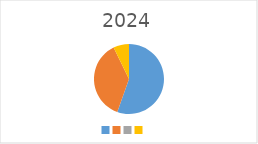
| Category | Series 0 |
|---|---|
|  | 153000 |
|  | 103000 |
|  | 0 |
|  | 20000 |